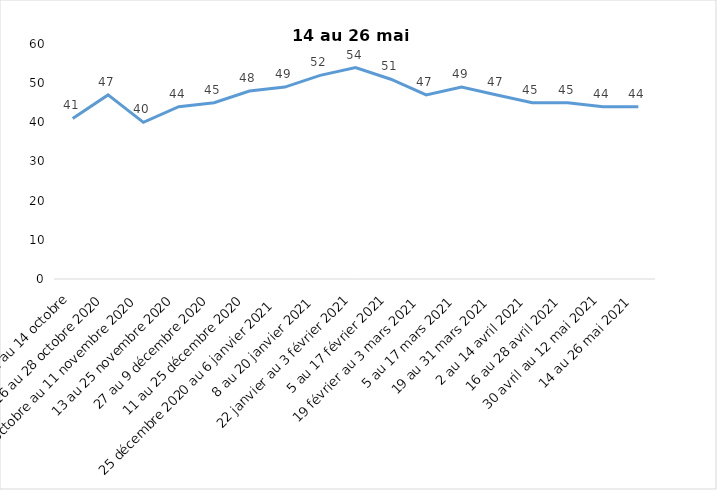
| Category | Toujours aux trois mesures |
|---|---|
| 2 au 14 octobre | 41 |
| 16 au 28 octobre 2020 | 47 |
| 30 octobre au 11 novembre 2020 | 40 |
| 13 au 25 novembre 2020 | 44 |
| 27 au 9 décembre 2020 | 45 |
| 11 au 25 décembre 2020 | 48 |
| 25 décembre 2020 au 6 janvier 2021 | 49 |
| 8 au 20 janvier 2021 | 52 |
| 22 janvier au 3 février 2021 | 54 |
| 5 au 17 février 2021 | 51 |
| 19 février au 3 mars 2021 | 47 |
| 5 au 17 mars 2021 | 49 |
| 19 au 31 mars 2021 | 47 |
| 2 au 14 avril 2021 | 45 |
| 16 au 28 avril 2021 | 45 |
| 30 avril au 12 mai 2021 | 44 |
| 14 au 26 mai 2021 | 44 |